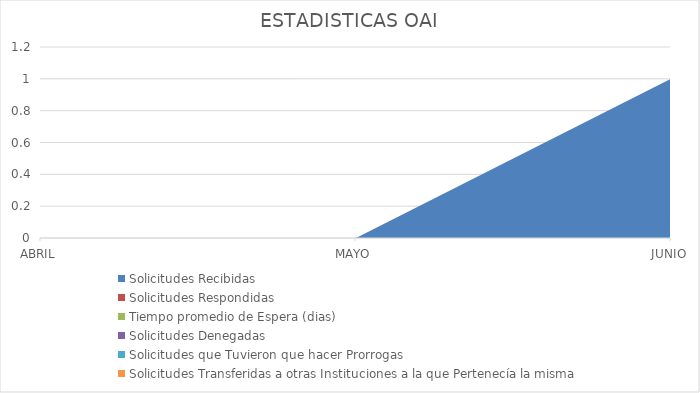
| Category | Solicitudes Recibidas | Solicitudes Respondidas | Tiempo promedio de Espera (dias) | Solicitudes Denegadas | Solicitudes que Tuvieron que hacer Prorrogas  | Solicitudes Transferidas a otras Instituciones a la que Pertenecía la misma |
|---|---|---|---|---|---|---|
| ABRIL | 0 | 0 | 0 | 0 | 0 | 0 |
| MAYO | 0 | 0 | 0 | 0 | 0 | 0 |
| JUNIO | 1 | 0 | 0 | 0 | 0 | 0 |